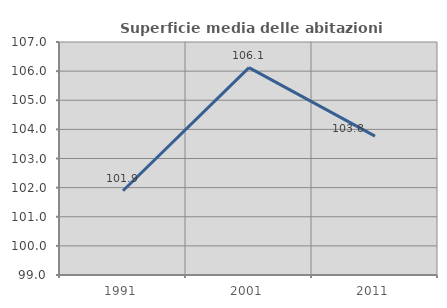
| Category | Superficie media delle abitazioni occupate |
|---|---|
| 1991.0 | 101.893 |
| 2001.0 | 106.119 |
| 2011.0 | 103.77 |